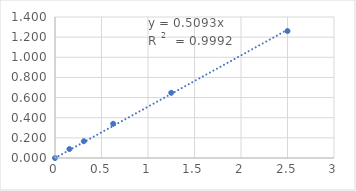
| Category | Series 0 |
|---|---|
| 0.0 | 0 |
| 0.15500000000000003 | 0.089 |
| 0.31000000000000005 | 0.167 |
| 0.625 | 0.34 |
| 1.25 | 0.648 |
| 2.5 | 1.261 |